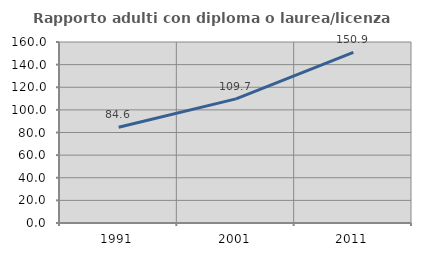
| Category | Rapporto adulti con diploma o laurea/licenza media  |
|---|---|
| 1991.0 | 84.615 |
| 2001.0 | 109.732 |
| 2011.0 | 150.871 |